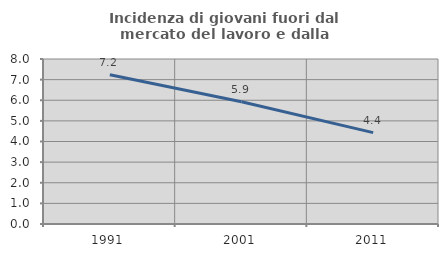
| Category | Incidenza di giovani fuori dal mercato del lavoro e dalla formazione  |
|---|---|
| 1991.0 | 7.24 |
| 2001.0 | 5.925 |
| 2011.0 | 4.429 |